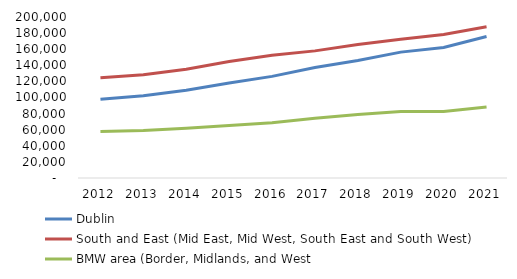
| Category | Dublin | South and East (Mid East, Mid West, South East and South West) | BMW area (Border, Midlands, and West |
|---|---|---|---|
| 2012.0 | 97718 | 124631 | 57649 |
| 2013.0 | 102250 | 128197 | 59138 |
| 2014.0 | 108891 | 135212 | 61854 |
| 2015.0 | 118031 | 144794 | 65113 |
| 2016.0 | 126257 | 152431 | 68712 |
| 2017.0 | 137378 | 157911 | 74178 |
| 2018.0 | 145899 | 165911 | 78879 |
| 2019.0 | 156380 | 172476 | 82677 |
| 2020.0 | 162108 | 178213 | 82715 |
| 2021.0 | 175830 | 187819 | 88296 |